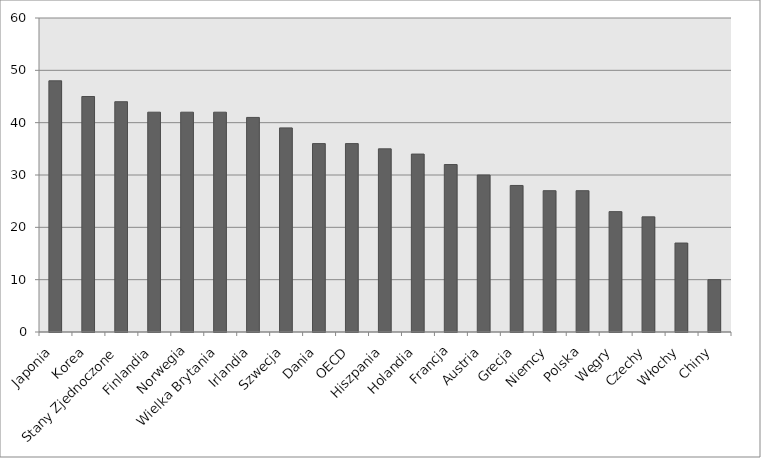
| Category | Udział populacji  z wyższym wykształceniem w grupie wiekowej 25 - 64 lata w  |
|---|---|
| Japonia | 48 |
| Korea | 45 |
| Stany Zjednoczone | 44 |
| Finlandia | 42 |
| Norwegia | 42 |
| Wielka Brytania | 42 |
| Irlandia | 41 |
| Szwecja | 39 |
| Dania | 36 |
| OECD | 36 |
| Hiszpania | 35 |
| Holandia | 34 |
| Francja | 32 |
| Austria | 30 |
| Grecja | 28 |
| Niemcy | 27 |
| Polska | 27 |
| Węgry | 23 |
| Czechy | 22 |
| Włochy | 17 |
| Chiny | 10 |